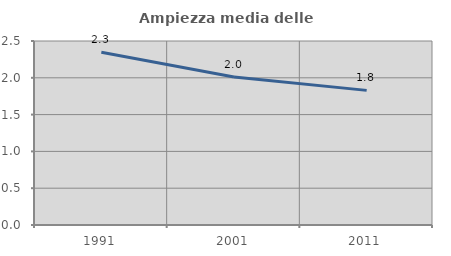
| Category | Ampiezza media delle famiglie |
|---|---|
| 1991.0 | 2.347 |
| 2001.0 | 2.01 |
| 2011.0 | 1.829 |